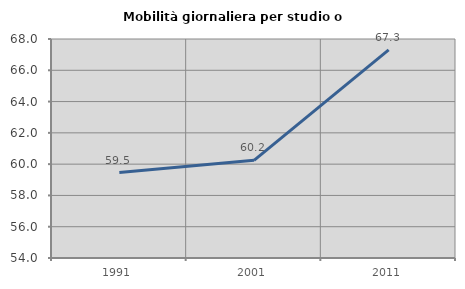
| Category | Mobilità giornaliera per studio o lavoro |
|---|---|
| 1991.0 | 59.462 |
| 2001.0 | 60.245 |
| 2011.0 | 67.308 |